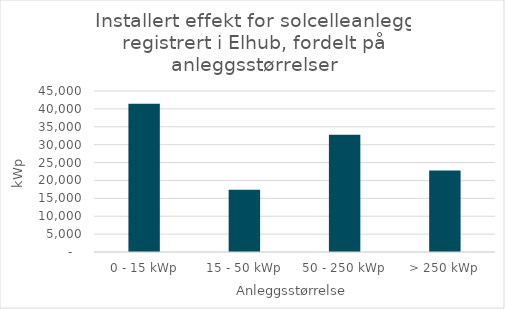
| Category | Installert effekt i kWp |
|---|---|
| 0 - 15 kWp | 41411 |
| 15 - 50 kWp | 17432 |
| 50 - 250 kWp | 32780 |
| > 250 kWp | 22747 |